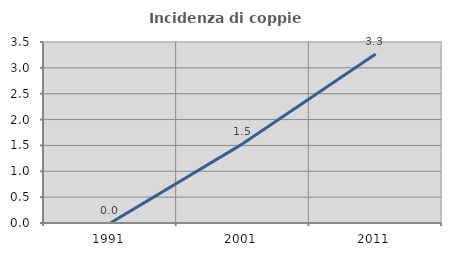
| Category | Incidenza di coppie miste |
|---|---|
| 1991.0 | 0 |
| 2001.0 | 1.535 |
| 2011.0 | 3.267 |